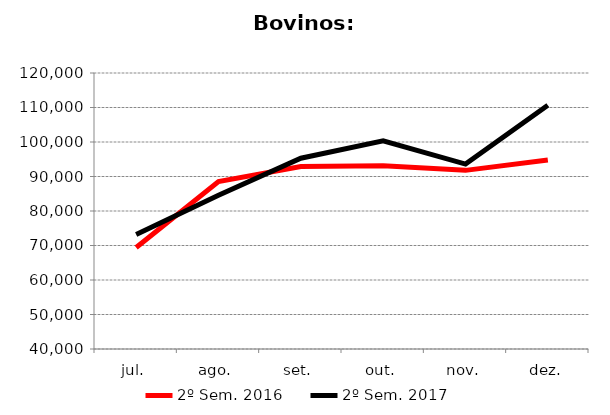
| Category | 2º Sem. 2016 | 2º Sem. 2017 |
|---|---|---|
| jul. | 69442 | 73204 |
| ago. | 88546 | 84558 |
| set. | 92878 | 95300 |
| out. | 93098 | 100364 |
| nov. | 91779 | 93604 |
| dez. | 94813 | 110648 |